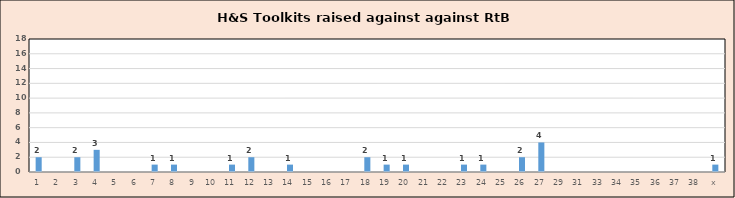
| Category | Series 0 |
|---|---|
| 1 | 2 |
| 2 | 0 |
| 3 | 2 |
| 4 | 3 |
| 5 | 0 |
| 6 | 0 |
| 7 | 1 |
| 8 | 1 |
| 9 | 0 |
| 10 | 0 |
| 11 | 1 |
| 12 | 2 |
| 13 | 0 |
| 14 | 1 |
| 15 | 0 |
| 16 | 0 |
| 17 | 0 |
| 18 | 2 |
| 19 | 1 |
| 20 | 1 |
| 21 | 0 |
| 22 | 0 |
| 23 | 1 |
| 24 | 1 |
| 25 | 0 |
| 26 | 2 |
| 27 | 4 |
| 29 | 0 |
| 31 | 0 |
| 33 | 0 |
| 34 | 0 |
| 35 | 0 |
| 36 | 0 |
| 37 | 0 |
| 38 | 0 |
| x | 1 |